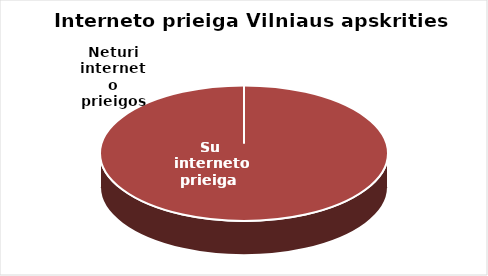
| Category | Series 0 |
|---|---|
| Su interneto prieiga  | 183 |
| Neturi interneto prieigos | 0 |